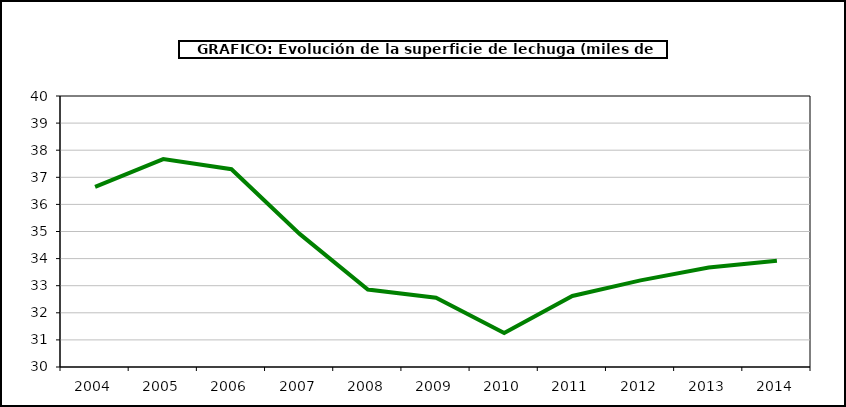
| Category | superficie |
|---|---|
| 2004.0 | 36.647 |
| 2005.0 | 37.673 |
| 2006.0 | 37.298 |
| 2007.0 | 34.912 |
| 2008.0 | 32.86 |
| 2009.0 | 32.557 |
| 2010.0 | 31.256 |
| 2011.0 | 32.62 |
| 2012.0 | 33.196 |
| 2013.0 | 33.669 |
| 2014.0 | 33.924 |